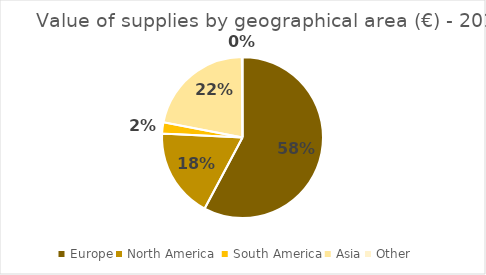
| Category | Europe |
|---|---|
| Europe | 885417700 |
| North America  | 275773880 |
| South America | 34183929 |
| Asia | 334770342 |
| Other | 1928467 |